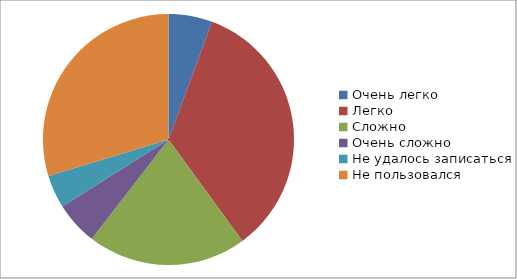
| Category | Series 0 |
|---|---|
| Очень легко | 78 |
| Легко | 474 |
| Сложно | 283 |
| Очень сложно | 77 |
| Не удалось записаться | 59 |
| Не пользовался | 410 |